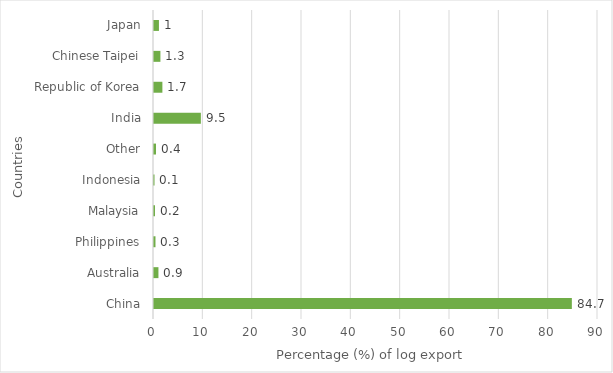
| Category | Series 0 |
|---|---|
| China | 84.7 |
| Australia | 0.9 |
| Philippines | 0.3 |
| Malaysia | 0.2 |
| Indonesia | 0.1 |
| Other | 0.4 |
| India | 9.5 |
| Republic of Korea | 1.7 |
| Chinese Taipei | 1.3 |
| Japan | 1 |